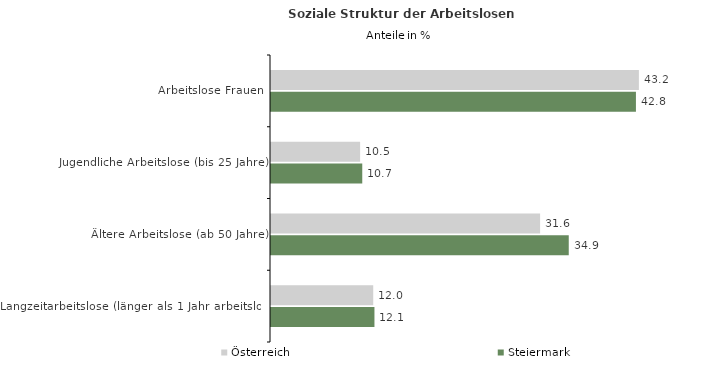
| Category | Österreich | Steiermark |
|---|---|---|
| Arbeitslose Frauen | 43.18 | 42.833 |
| Jugendliche Arbeitslose (bis 25 Jahre) | 10.46 | 10.711 |
| Ältere Arbeitslose (ab 50 Jahre) | 31.584 | 34.947 |
| Langzeitarbeitslose (länger als 1 Jahr arbeitslos) | 11.999 | 12.142 |